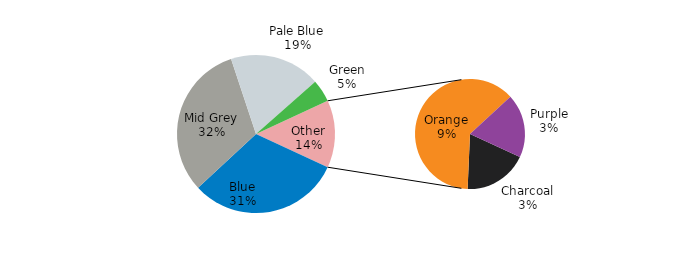
| Category | 1975-76 |
|---|---|
| Blue | 36.19 |
| Mid Grey | 36.88 |
| Pale Blue | 21.56 |
| Green | 5.36 |
| Charcoal | 3.01 |
| Orange | 10 |
| Purple | 3.01 |